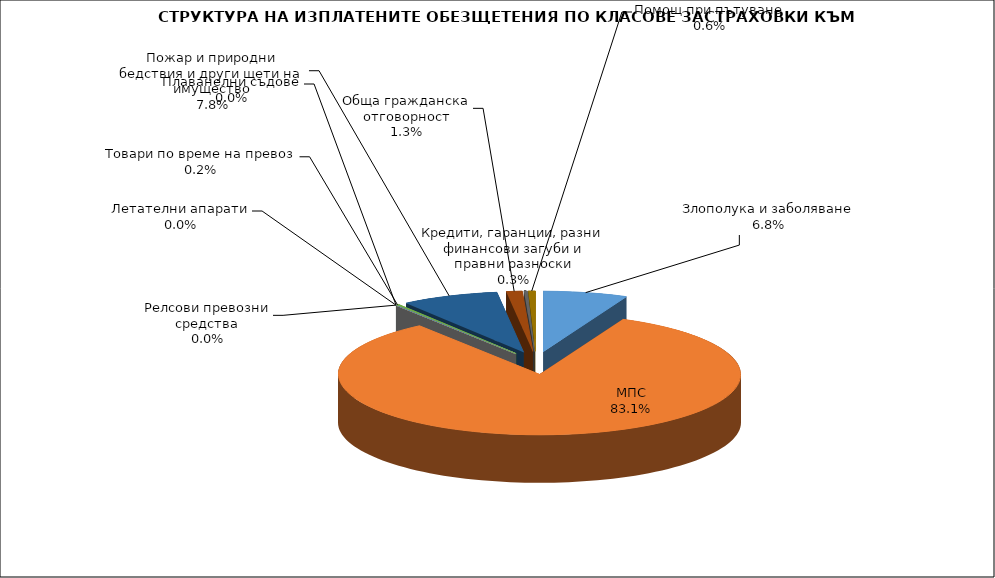
| Category | Злополука и заболяване МПС Релсови превозни средства Летателни апарати Плаванелни съдове Товари по време на превоз Пожар и природни бедствия и други щети на имущество Обща гражданска отговорност Кредити, гаранции, разни финансови загуби и правни разноски  |
|---|---|
| Злополука и заболяване | 0.068 |
| МПС | 0.831 |
| Релсови превозни средства | 0 |
| Летателни апарати | 0 |
| Плаванелни съдове | 0 |
| Товари по време на превоз | 0.002 |
| Пожар и природни бедствия и други щети на имущество | 0.078 |
| Обща гражданска отговорност | 0.013 |
| Кредити, гаранции, разни финансови загуби и правни разноски | 0.003 |
| Помощ при пътуване | 0.006 |